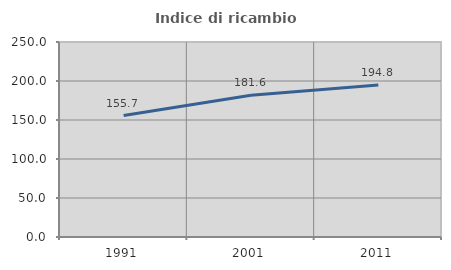
| Category | Indice di ricambio occupazionale  |
|---|---|
| 1991.0 | 155.689 |
| 2001.0 | 181.624 |
| 2011.0 | 194.755 |